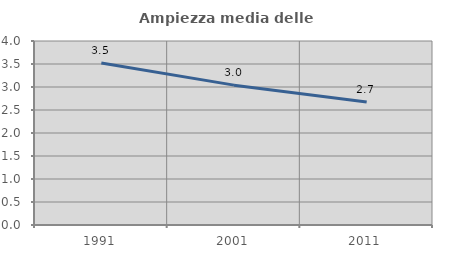
| Category | Ampiezza media delle famiglie |
|---|---|
| 1991.0 | 3.524 |
| 2001.0 | 3.04 |
| 2011.0 | 2.673 |